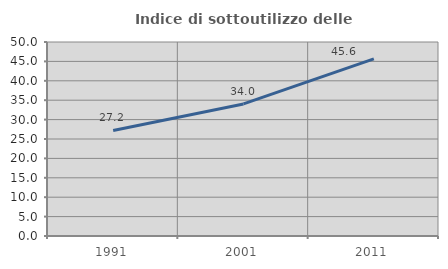
| Category | Indice di sottoutilizzo delle abitazioni  |
|---|---|
| 1991.0 | 27.203 |
| 2001.0 | 34.044 |
| 2011.0 | 45.635 |